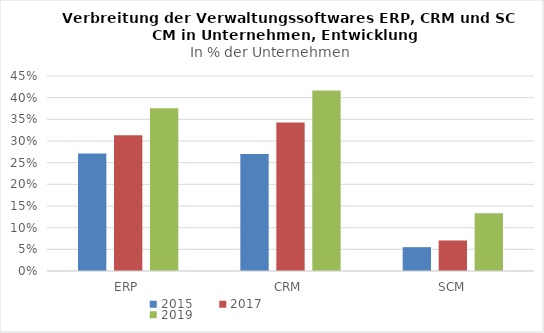
| Category | 2015 | 2017 | 2019 |
|---|---|---|---|
| 0 |  |  | 0.375 |
| 1 |  |  | 0.417 |
| 2 |  |  | 0.133 |